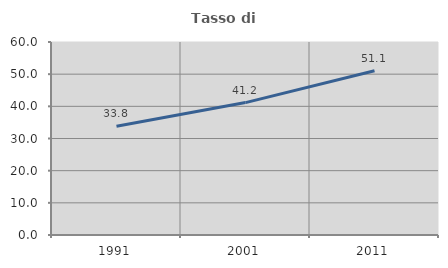
| Category | Tasso di occupazione   |
|---|---|
| 1991.0 | 33.831 |
| 2001.0 | 41.162 |
| 2011.0 | 51.078 |